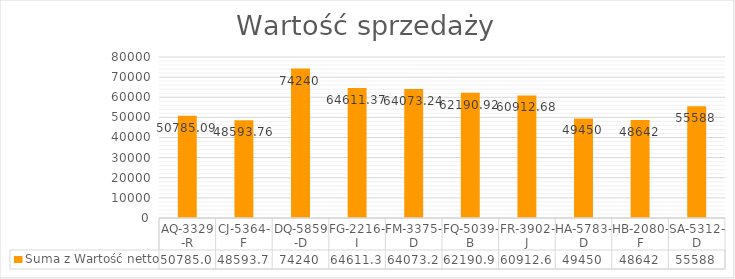
| Category | Suma |
|---|---|
| AQ-3329-R | 50785.09 |
| CJ-5364-F | 48593.76 |
| DQ-5859-D | 74240 |
| FG-2216-I | 64611.37 |
| FM-3375-D | 64073.24 |
| FQ-5039-B | 62190.92 |
| FR-3902-J | 60912.68 |
| HA-5783-D | 49450 |
| HB-2080-F | 48642 |
| SA-5312-D | 55588 |